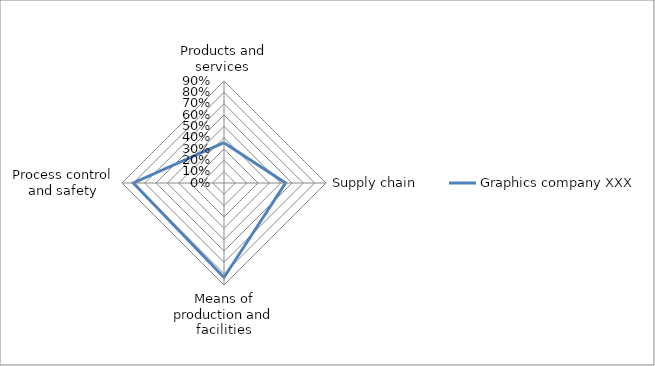
| Category | Graphics company XXX |
|---|---|
| Products and services  | 0.356 |
| Supply chain | 0.543 |
| Means of production and facilities | 0.833 |
| Process control and safety | 0.8 |